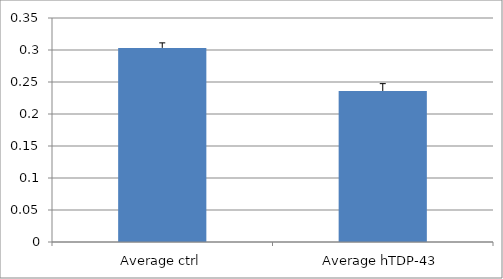
| Category | Series 0 |
|---|---|
| Average ctrl | 0.303 |
| Average hTDP-43 | 0.236 |